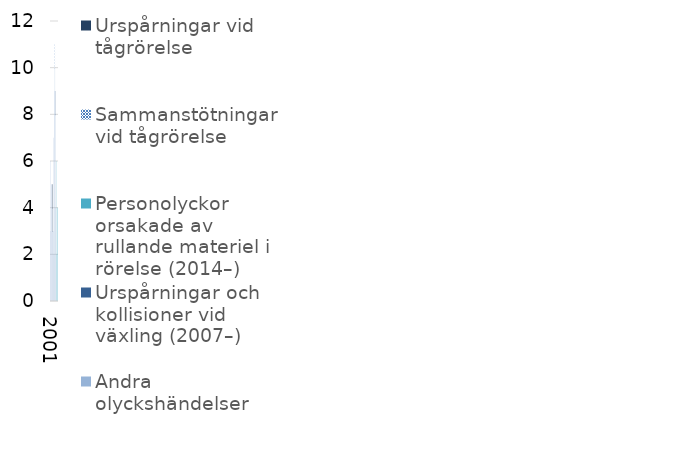
| Category | Andra olyckshändelser | Urspårningar och kollisioner vid växling (2007–) | Personolyckor orsakade av rullande materiel i rörelse (2014–) | Sammanstötningar vid tågrörelse | Urspårningar vid tågrörelse |
|---|---|---|---|---|---|
| 2001 | 3 | 0 | 0 | 0 | 0 |
| 2002 | 6 | 0 | 0 | 0 | 0 |
| 2003 | 5 | 0 | 0 | 0 | 0 |
| 2004 | 5 | 0 | 0 | 0 | 0 |
| 2005 | 3 | 0 | 0 | 0 | 2 |
| 2006 | 4 | 0 | 0 | 0 | 1 |
| 2007 | 3 | 0 | 0 | 0 | 0 |
| 2008 | 7 | 0 | 0 | 0 | 0 |
| 2009 | 2 | 0 | 0 | 0 | 0 |
| 2010 | 9 | 0 | 0 | 0 | 0 |
| 2011 | 10 | 0 | 0 | 1 | 0 |
| 2012 | 8 | 1 | 0 | 0 | 0 |
| 2013 | 4 | 0 | 0 | 0 | 0 |
| 2014 | 0 | 0 | 2 | 0 | 0 |
| 2015 | 0 | 0 | 6 | 0 | 0 |
| 2016 | 0 | 0 | 4 | 0 | 0 |
| 2017 | 0 | 0 | 4 | 0 | 0 |